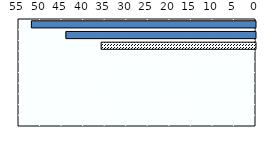
| Category | Length in weeks |
|---|---|
| Korea | 52 |
| Japan | 44 |
| OECD average | 35.824 |
| Australia | 0 |
| China | 0 |
| Indonesia | 0 |
| New Zealand | 0 |
| Singapore | 0 |
| Thailand | 0 |
| Viet Nam | 0 |